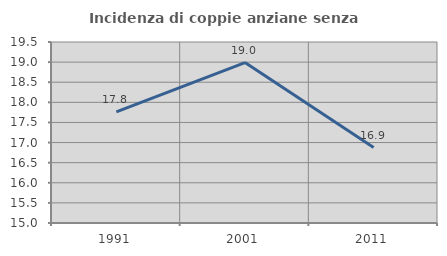
| Category | Incidenza di coppie anziane senza figli  |
|---|---|
| 1991.0 | 17.763 |
| 2001.0 | 18.987 |
| 2011.0 | 16.875 |